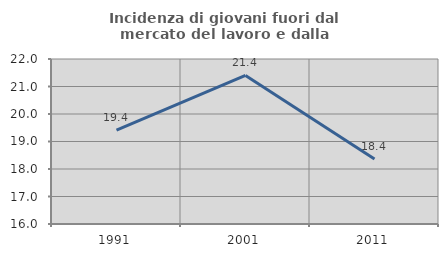
| Category | Incidenza di giovani fuori dal mercato del lavoro e dalla formazione  |
|---|---|
| 1991.0 | 19.41 |
| 2001.0 | 21.401 |
| 2011.0 | 18.361 |